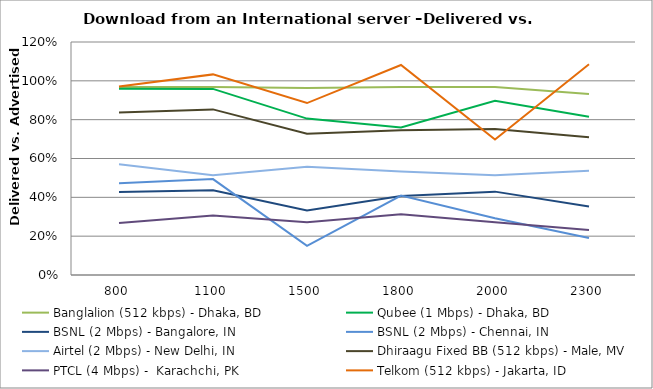
| Category | Banglalion (512 kbps) - Dhaka, BD | Qubee (1 Mbps) - Dhaka, BD | BSNL (2 Mbps) - Bangalore, IN | BSNL (2 Mbps) - Chennai, IN | Airtel (2 Mbps) - New Delhi, IN | Dhiraagu Fixed BB (512 kbps) - Male, MV | PTCL (4 Mbps) -  Karachchi, PK | Telkom (512 kbps) - Jakarta, ID |
|---|---|---|---|---|---|---|---|---|
| 800.0 | 0.968 | 0.96 | 0.428 | 0.472 | 0.571 | 0.837 | 0.268 | 0.971 |
| 1100.0 | 0.969 | 0.958 | 0.437 | 0.494 | 0.514 | 0.853 | 0.306 | 1.033 |
| 1500.0 | 0.963 | 0.806 | 0.332 | 0.15 | 0.557 | 0.728 | 0.272 | 0.886 |
| 1800.0 | 0.968 | 0.76 | 0.407 | 0.409 | 0.533 | 0.745 | 0.313 | 1.082 |
| 2000.0 | 0.968 | 0.898 | 0.429 | 0.292 | 0.514 | 0.751 | 0.272 | 0.698 |
| 2300.0 | 0.933 | 0.814 | 0.353 | 0.191 | 0.537 | 0.709 | 0.232 | 1.085 |